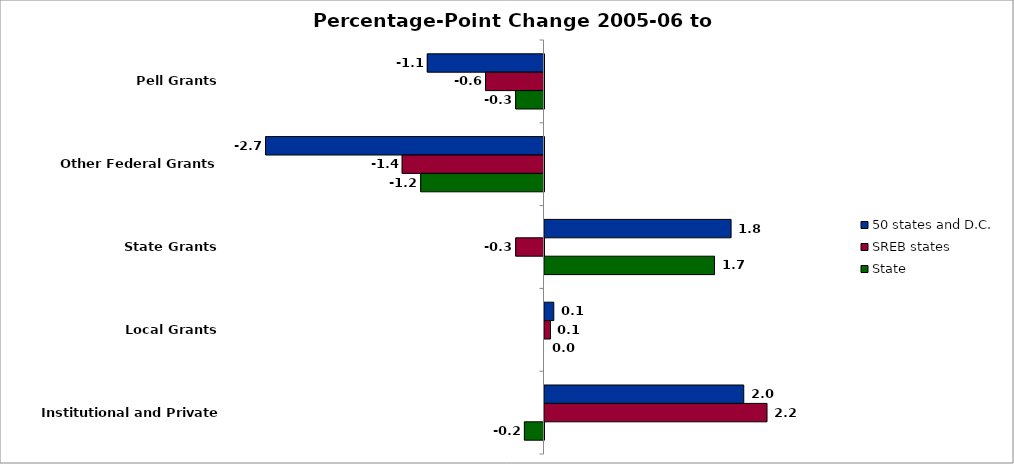
| Category | 50 states and D.C. | SREB states | State |
|---|---|---|---|
| Pell Grants | -1.142 | -0.572 | -0.278 |
| Other Federal Grants | -2.725 | -1.388 | -1.207 |
| State Grants | 1.826 | -0.277 | 1.664 |
| Local Grants | 0.091 | 0.059 | 0 |
| Institutional and Private Grants | 1.95 | 2.178 | -0.192 |